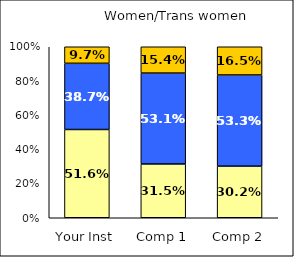
| Category | Low Job Satisfaction: Compensation | Average Job Satisfaction: Compensation | High Job Satisfaction: Compensation |
|---|---|---|---|
| Your Inst | 0.516 | 0.387 | 0.097 |
| Comp 1 | 0.315 | 0.531 | 0.154 |
| Comp 2 | 0.302 | 0.533 | 0.165 |